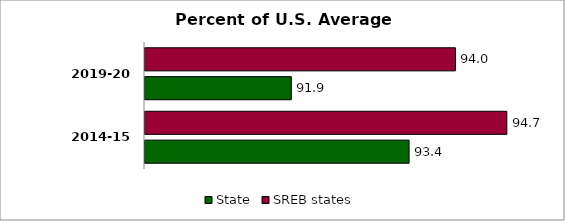
| Category | State | SREB states |
|---|---|---|
| 2014-15 | 93.403 | 94.663 |
| 2019-20 | 91.886 | 94 |